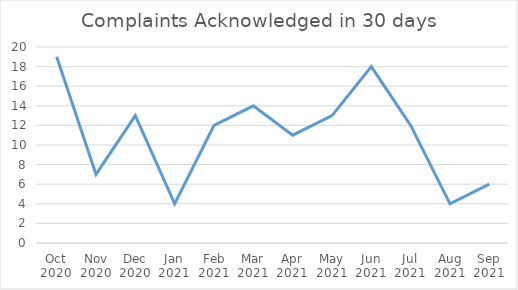
| Category | Number |
|---|---|
| Oct 2020 | 19 |
| Nov 2020 | 7 |
| Dec 2020 | 13 |
| Jan 2021 | 4 |
| Feb 2021 | 12 |
| Mar 2021 | 14 |
| Apr 2021 | 11 |
| May 2021 | 13 |
| Jun 2021 | 18 |
| Jul 2021 | 12 |
| Aug 2021 | 4 |
| Sep 2021 | 6 |